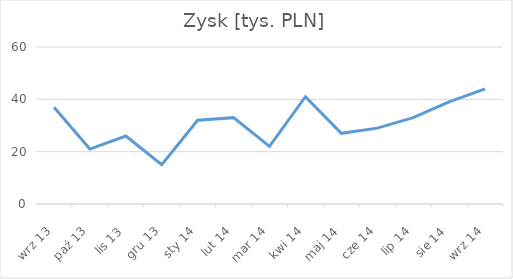
| Category | Zysk [tys. PLN] |
|---|---|
| 2013-09-13 | 37 |
| 2013-10-13 | 21 |
| 2013-11-13 | 26 |
| 2013-12-13 | 15 |
| 2014-01-13 | 32 |
| 2014-02-13 | 33 |
| 2014-03-13 | 22 |
| 2014-04-13 | 41 |
| 2014-05-13 | 27 |
| 2014-06-13 | 29 |
| 2014-07-13 | 33 |
| 2014-08-13 | 39 |
| 2014-09-13 | 44 |